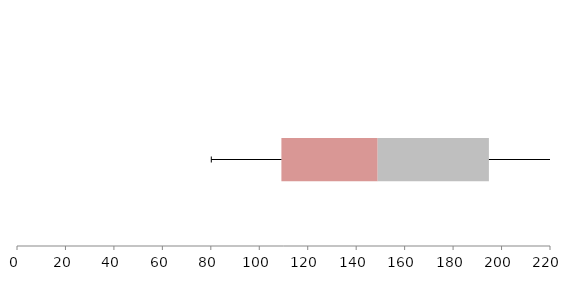
| Category | Series 1 | Series 2 | Series 3 |
|---|---|---|---|
| 0 | 109.137 | 39.739 | 45.905 |